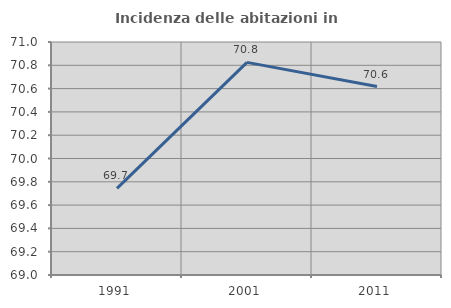
| Category | Incidenza delle abitazioni in proprietà  |
|---|---|
| 1991.0 | 69.743 |
| 2001.0 | 70.825 |
| 2011.0 | 70.618 |